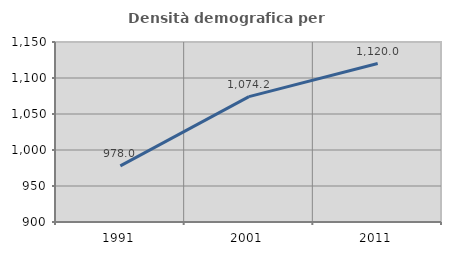
| Category | Densità demografica |
|---|---|
| 1991.0 | 978.046 |
| 2001.0 | 1074.173 |
| 2011.0 | 1120.047 |